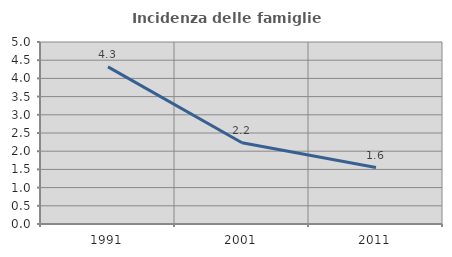
| Category | Incidenza delle famiglie numerose |
|---|---|
| 1991.0 | 4.317 |
| 2001.0 | 2.234 |
| 2011.0 | 1.551 |